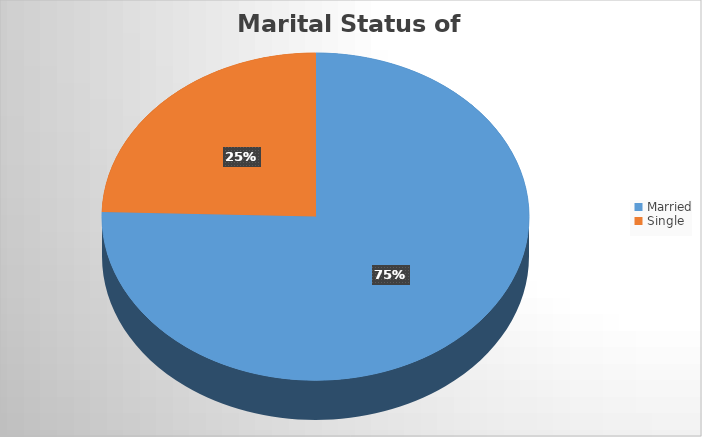
| Category | Marital Status of HouseholdHead |
|---|---|
| Married | 298 |
| Single | 97 |